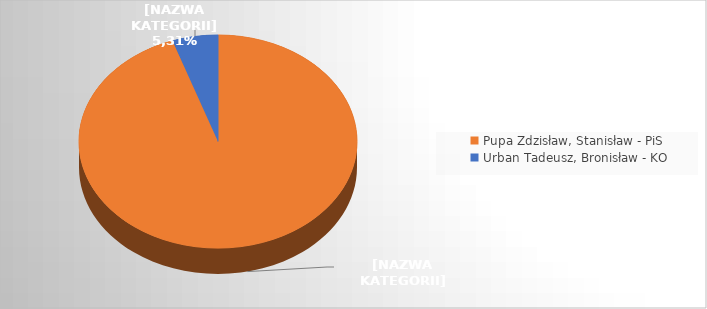
| Category | Series 0 |
|---|---|
| Pupa Zdzisław, Stanisław - PiS | 0.947 |
| Urban Tadeusz, Bronisław - KO | 0.053 |